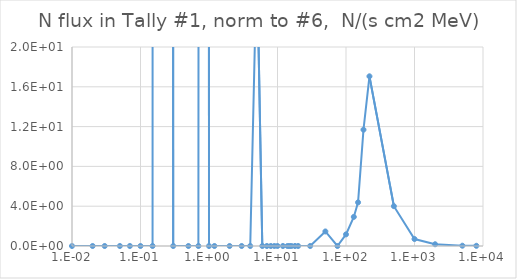
| Category | Series 0 |
|---|---|
| 1e-09 | 0 |
| 1e-08 | 0 |
| 2.5e-08 | 0 |
| 1e-07 | 0 |
| 2e-07 | 0 |
| 5e-07 | 0 |
| 1e-06 | 0 |
| 2e-06 | 0 |
| 5e-06 | 0 |
| 1e-05 | 0 |
| 2e-05 | 0 |
| 5e-05 | 0 |
| 0.0001 | 0 |
| 0.0002 | 0 |
| 0.0005 | 0 |
| 0.001 | 0 |
| 0.002 | 0 |
| 0.005 | 0 |
| 0.01 | 0 |
| 0.02 | 0 |
| 0.03 | 0 |
| 0.05 | 0 |
| 0.07 | 0 |
| 0.1 | 0 |
| 0.15 | 0 |
| 0.2 | 290.882 |
| 0.3 | 0 |
| 0.5 | 0 |
| 0.7 | 0 |
| 0.9 | 291.551 |
| 1.0 | 0 |
| 1.2 | 0 |
| 2.0 | 0 |
| 3.0 | 0 |
| 4.0 | 0 |
| 5.0 | 29.221 |
| 6.0 | 0 |
| 7.0 | 0 |
| 8.0 | 0 |
| 9.0 | 0 |
| 10.0 | 0 |
| 12.0 | 0 |
| 14.0 | 0 |
| 15.0 | 0 |
| 16.0 | 0 |
| 18.0 | 0 |
| 20.0 | 0 |
| 30.0 | 0 |
| 50.0 | 29.221 |
| 75.0 | 0 |
| 100.0 | 29.221 |
| 130.0 | 87.662 |
| 150.0 | 87.662 |
| 180.0 | 350.648 |
| 220.0 | 682.169 |
| 500.0 | 1120.981 |
| 1000.0 | 350.704 |
| 2000.0 | 175.323 |
| 5000.0 | 87.662 |
| 8000.0 | 58.441 |